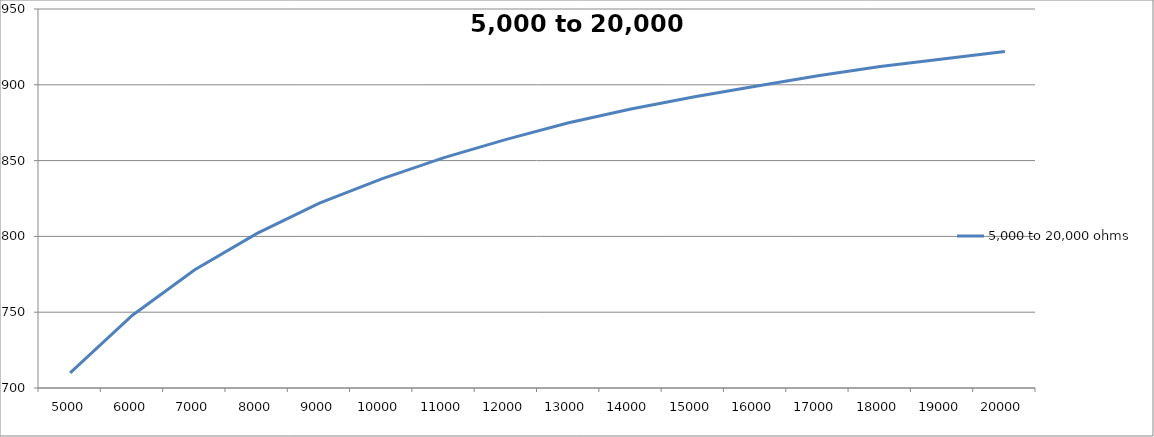
| Category | 5,000 to 20,000 ohms |
|---|---|
| 5000.0 | 710 |
| 6000.0 | 748 |
| 7000.0 | 778 |
| 8000.0 | 802 |
| 9000.0 | 822 |
| 10000.0 | 838 |
| 11000.0 | 852 |
| 12000.0 | 864 |
| 13000.0 | 875 |
| 14000.0 | 884 |
| 15000.0 | 892 |
| 16000.0 | 899 |
| 17000.0 | 906 |
| 18000.0 | 912 |
| 19000.0 | 917 |
| 20000.0 | 922 |